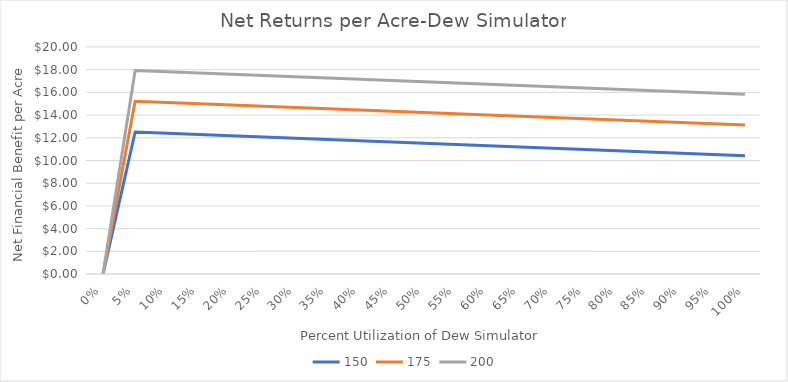
| Category | 150 | 175 | 200 |
|---|---|---|---|
| 0.0 | 0 | 0 | 0 |
| 0.05 | 12.51 | 15.222 | 17.934 |
| 0.1 | 12.399 | 15.111 | 17.823 |
| 0.15 | 12.289 | 15.001 | 17.713 |
| 0.2 | 12.178 | 14.89 | 17.602 |
| 0.25 | 12.068 | 14.78 | 17.492 |
| 0.3 | 11.958 | 14.67 | 17.382 |
| 0.35 | 11.847 | 14.559 | 17.271 |
| 0.4 | 11.737 | 14.449 | 17.161 |
| 0.45 | 11.626 | 14.338 | 17.05 |
| 0.5 | 11.516 | 14.228 | 16.94 |
| 0.55 | 11.405 | 14.118 | 16.83 |
| 0.6 | 11.295 | 14.007 | 16.719 |
| 0.65 | 11.185 | 13.897 | 16.609 |
| 0.7 | 11.074 | 13.786 | 16.498 |
| 0.75 | 10.964 | 13.676 | 16.388 |
| 0.8 | 10.853 | 13.565 | 16.277 |
| 0.85 | 10.743 | 13.455 | 16.167 |
| 0.9 | 10.633 | 13.345 | 16.057 |
| 0.95 | 10.522 | 13.234 | 15.946 |
| 1.0 | 10.412 | 13.124 | 15.836 |